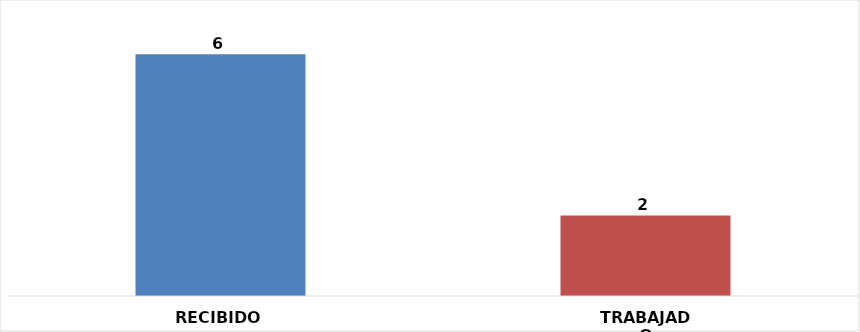
| Category | RECIBIDO |
|---|---|
| RECIBIDO | 6 |
| TRABAJADO | 2 |